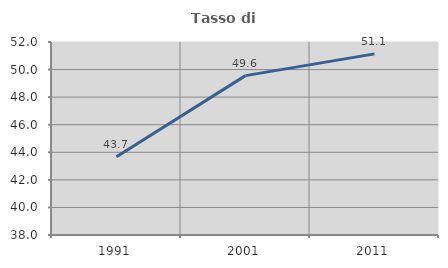
| Category | Tasso di occupazione   |
|---|---|
| 1991.0 | 43.678 |
| 2001.0 | 49.561 |
| 2011.0 | 51.139 |